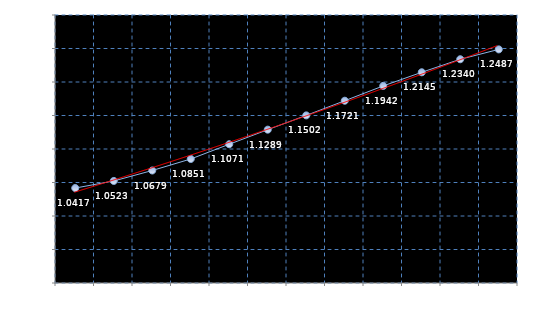
| Category | Series 0 |
|---|---|
| Mar 16 | 1.042 |
| Apr 16 | 1.052 |
| May 16 | 1.068 |
| Jun 16 | 1.085 |
| Jul 16 | 1.107 |
| Aug 16 | 1.129 |
| Sep 16 | 1.15 |
| Oct 16 | 1.172 |
| Nov 16 | 1.194 |
| Dec 16 | 1.215 |
| Jan 17 | 1.234 |
| Feb 17 | 1.249 |